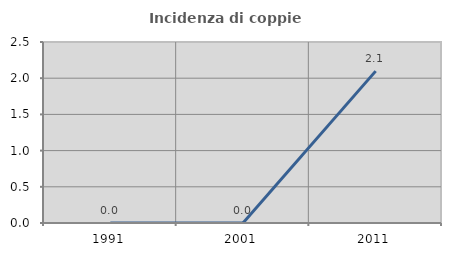
| Category | Incidenza di coppie miste |
|---|---|
| 1991.0 | 0 |
| 2001.0 | 0 |
| 2011.0 | 2.098 |